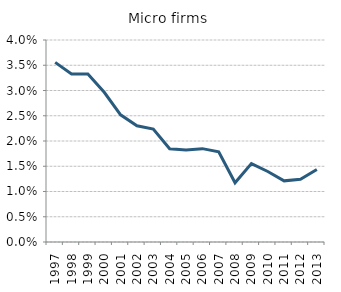
| Category | mikro |
|---|---|
| 1997.0 | 0.036 |
| 1998.0 | 0.033 |
| 1999.0 | 0.033 |
| 2000.0 | 0.03 |
| 2001.0 | 0.025 |
| 2002.0 | 0.023 |
| 2003.0 | 0.022 |
| 2004.0 | 0.018 |
| 2005.0 | 0.018 |
| 2006.0 | 0.018 |
| 2007.0 | 0.018 |
| 2008.0 | 0.012 |
| 2009.0 | 0.016 |
| 2010.0 | 0.014 |
| 2011.0 | 0.012 |
| 2012.0 | 0.012 |
| 2013.0 | 0.014 |